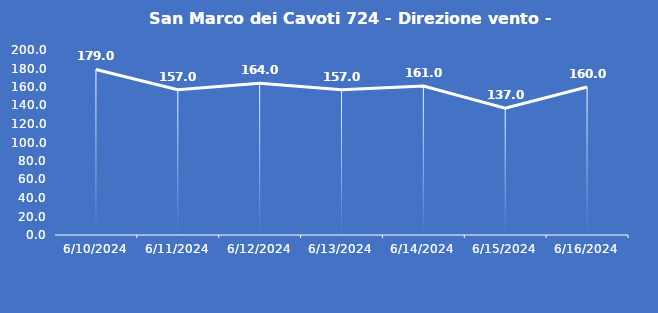
| Category | San Marco dei Cavoti 724 - Direzione vento - Grezzo (°N) |
|---|---|
| 6/10/24 | 179 |
| 6/11/24 | 157 |
| 6/12/24 | 164 |
| 6/13/24 | 157 |
| 6/14/24 | 161 |
| 6/15/24 | 137 |
| 6/16/24 | 160 |